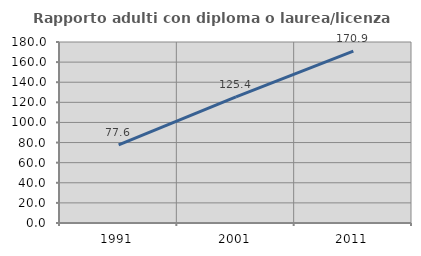
| Category | Rapporto adulti con diploma o laurea/licenza media  |
|---|---|
| 1991.0 | 77.612 |
| 2001.0 | 125.397 |
| 2011.0 | 170.894 |